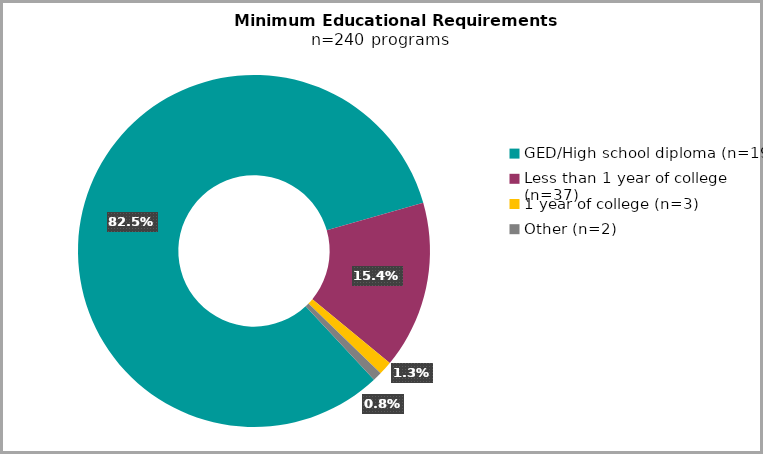
| Category | Series 0 |
|---|---|
| GED/High school diploma (n=198) | 0.825 |
| Less than 1 year of college (n=37) | 0.154 |
| 1 year of college (n=3) | 0.012 |
| Other (n=2) | 0.008 |